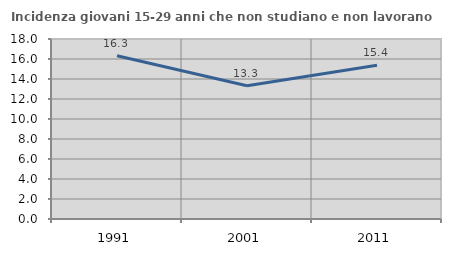
| Category | Incidenza giovani 15-29 anni che non studiano e non lavorano  |
|---|---|
| 1991.0 | 16.327 |
| 2001.0 | 13.333 |
| 2011.0 | 15.385 |